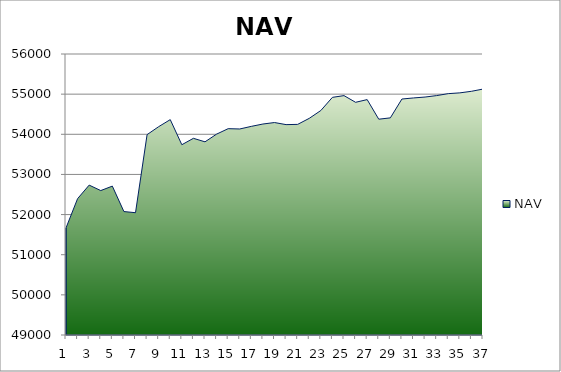
| Category | NAV |
|---|---|
| 0 | 51667 |
| 1 | 52397 |
| 2 | 52733.957 |
| 3 | 52597.875 |
| 4 | 52708.772 |
| 5 | 52075.184 |
| 6 | 52046.775 |
| 7 | 53991.219 |
| 8 | 54189.909 |
| 9 | 54364.909 |
| 10 | 53739.909 |
| 11 | 53899.542 |
| 12 | 53812.294 |
| 13 | 54003.961 |
| 14 | 54140.037 |
| 15 | 54132.37 |
| 16 | 54197.37 |
| 17 | 54255.812 |
| 18 | 54292.622 |
| 19 | 54240.699 |
| 20 | 54246.834 |
| 21 | 54397.391 |
| 22 | 54592.197 |
| 23 | 54920.119 |
| 24 | 54963.245 |
| 25 | 54796.799 |
| 26 | 54863.963 |
| 27 | 54375.975 |
| 28 | 54409.015 |
| 29 | 54878.402 |
| 30 | 54905.151 |
| 31 | 54927.958 |
| 32 | 54964.157 |
| 33 | 55012.385 |
| 34 | 55031.616 |
| 35 | 55070.791 |
| 36 | 55126.461 |